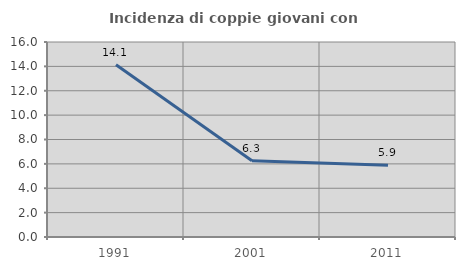
| Category | Incidenza di coppie giovani con figli |
|---|---|
| 1991.0 | 14.13 |
| 2001.0 | 6.25 |
| 2011.0 | 5.882 |